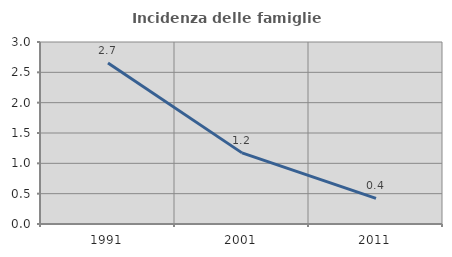
| Category | Incidenza delle famiglie numerose |
|---|---|
| 1991.0 | 2.654 |
| 2001.0 | 1.172 |
| 2011.0 | 0.421 |